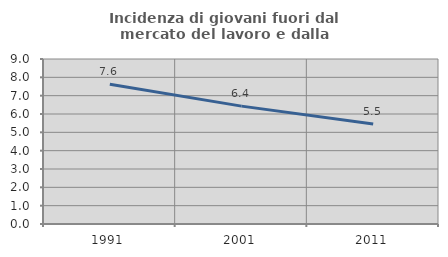
| Category | Incidenza di giovani fuori dal mercato del lavoro e dalla formazione  |
|---|---|
| 1991.0 | 7.619 |
| 2001.0 | 6.43 |
| 2011.0 | 5.455 |